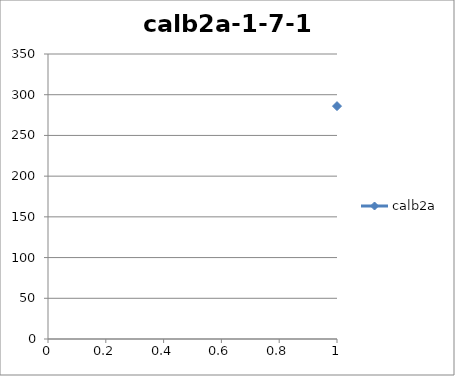
| Category | calb2a |
|---|---|
| 0 | 286 |
| 1 | 53 |
| 2 | 33 |
| 3 | 48 |
| 4 | 35 |
| 5 | 7 |
| 6 | 48 |
| 7 | 1 |
| 8 | 5 |
| 9 | 24 |
| 10 | 35 |